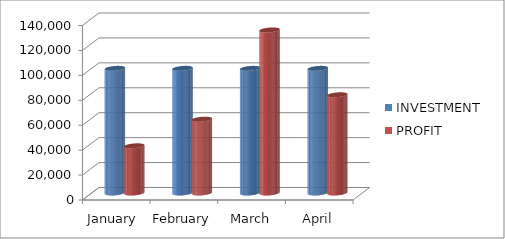
| Category | INVESTMENT  | PROFIT |
|---|---|---|
| January  | 100000 | 37854 |
| February | 100000 | 59215 |
| March | 100000 | 130800 |
| April | 100000 | 78790 |